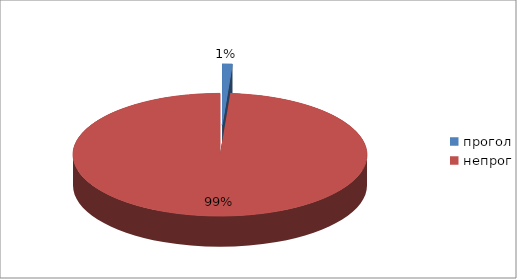
| Category | Series 0 |
|---|---|
| прогол | 23 |
| непрог | 2047 |